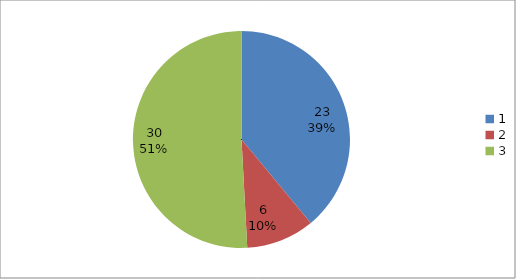
| Category | Series 0 |
|---|---|
| 0 | 23 |
| 1 | 6 |
| 2 | 30 |